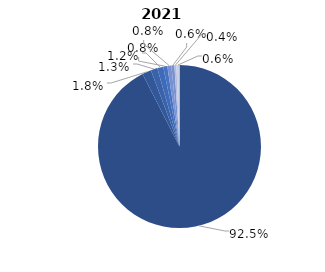
| Category | Series 0 |
|---|---|
|  Ministerul Afacerilor Interne | 0.925 |
| Autoritățile administrative din subordinea Ministerului Finanțelor | 0.018 |
| Judecătoriile raionale şi municipale | 0.013 |
| Serviciul  Vamal | 0.012 |
| Inspectoratul pentru Protecția Mediului | 0.008 |
| Ministerul Aparării | 0.008 |
| Comisiile administrative | 0.006 |
| Agenția Națională pentru Siguranța Alimentelor | 0.004 |
| Altele | 0.006 |